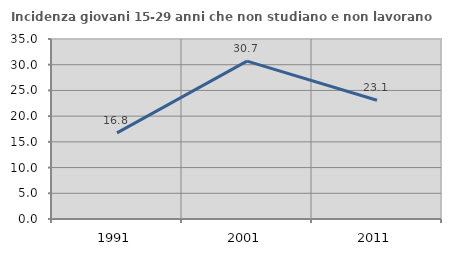
| Category | Incidenza giovani 15-29 anni che non studiano e non lavorano  |
|---|---|
| 1991.0 | 16.758 |
| 2001.0 | 30.706 |
| 2011.0 | 23.097 |